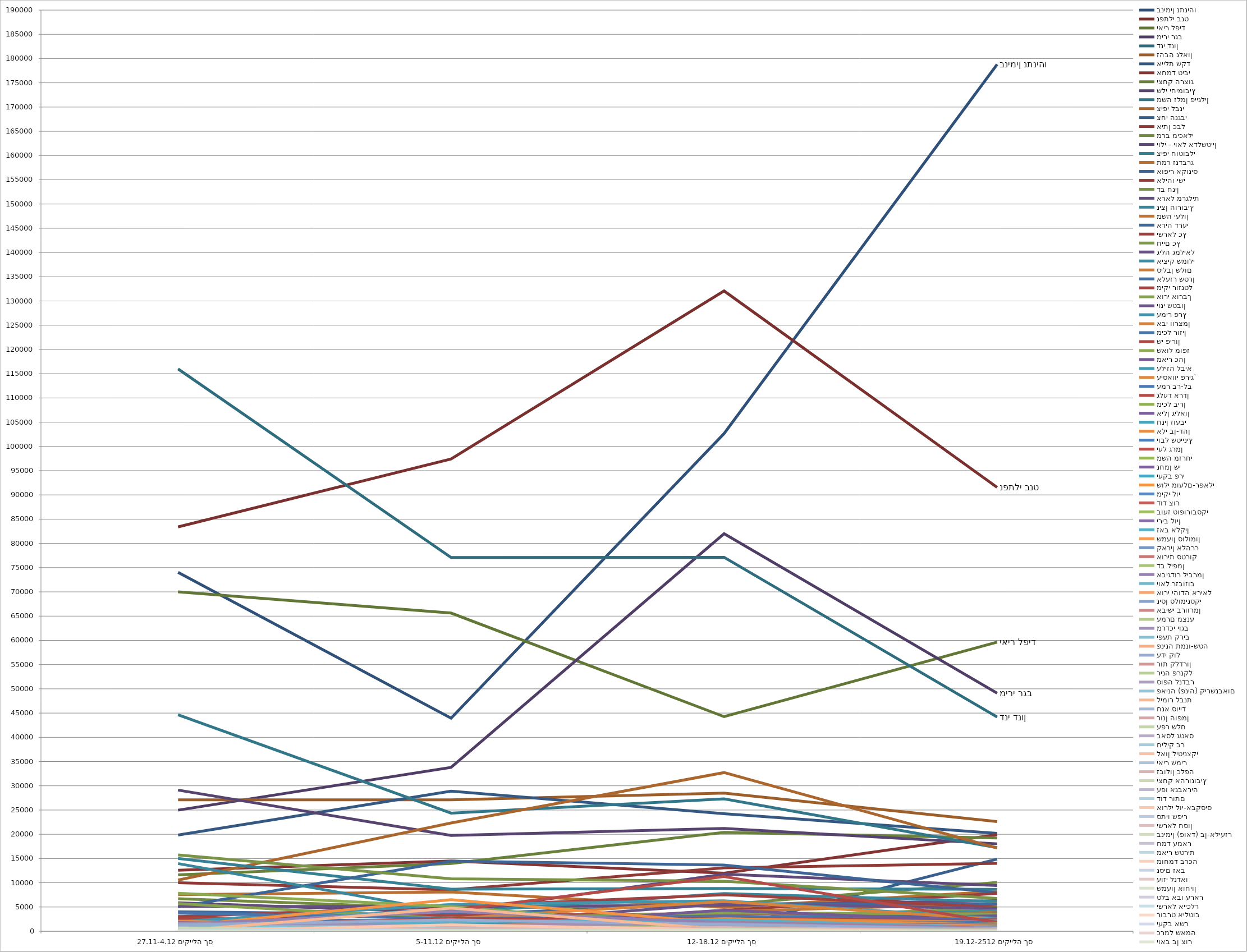
| Category | בנימין נתניהו | נפתלי בנט | יאיר לפיד | מירי רגב | דני דנון | זהבה גלאון | איילת שקד | אחמד טיבי | יצחק הרצוג | שלי יחימוביץ | משה זלמן פייגלין | ציפי לבני | צחי הנגבי | איתן כבל | מרב מיכאלי | יולי - יואל אדלשטיין | ציפי חוטובלי | תמר זנדברג | אופיר אקוניס | אליהו ישי | דב חנין | אראל מרגלית | ניצן הורוביץ | משה יעלון | אריה דרעי | ישראל כץ | חיים כץ | גילה גמליאל | איציק שמולי | סילבן שלום | אלעזר שטרן | מיקי רוזנטל | אורי אורבך | יוני שטבון | עמיר פרץ | אבי וורצמן | מיכל רוזין | שי פירון | שאול מופז | מאיר כהן | עליזה לביא | עיסאווי פריג` | עמר בר-לב | גלעד ארדן | מיכל בירן | אילן גילאון | חנין זועבי | אלי בן-דהן | יובל שטייניץ | יעל גרמן | משה מזרחי | נחמן שי | יעקב פרי | שולי מועלם-רפאלי | מיקי לוי | דוד צור | בועז טופורובסקי | יריב לוין | זאב אלקין | שמעון סולומון | קארין אלהרר | אורית סטרוק | דב ליפמן | אביגדור ליברמן | יואל רזבוזוב | אורי יהודה אריאל | ניסן סלומינסקי | אבישי ברוורמן | עמרם מצנע | מרדכי יוגב | יפעת קריב | פנינה תמנו-שטה | עדי קול | רות קלדרון | רינה פרנקל | סופה לנדבר | פאינה (פניה) קירשנבאום | לימור לבנת | חנא סוייד | רונן הופמן | עפר שלח | באסל גטאס | חיליק בר | לאון ליטינצקי | יאיר שמיר | זבולון כלפה | יצחק אהרונוביץ | עפו אגבאריה | דוד רותם | אורלי לוי-אבקסיס | סתיו שפיר | ישראל חסון | בנימין (פואד) בן-אליעזר | חמד עמאר | מאיר שטרית | מוחמד ברכה | נסים זאב | עוזי לנדאו | שמעון אוחיון | טלב אבו עראר | ישראל אייכלר | רוברט אילטוב | יעקב אשר | כרמל שאמה | יואב בן צור |
|---|---|---|---|---|---|---|---|---|---|---|---|---|---|---|---|---|---|---|---|---|---|---|---|---|---|---|---|---|---|---|---|---|---|---|---|---|---|---|---|---|---|---|---|---|---|---|---|---|---|---|---|---|---|---|---|---|---|---|---|---|---|---|---|---|---|---|---|---|---|---|---|---|---|---|---|---|---|---|---|---|---|---|---|---|---|---|---|---|---|---|---|---|---|---|---|---|---|---|---|---|---|---|---|---|---|
| סך הלייקים 27.11-4.12 | 74031 | 83399 | 70018 | 24976 | 115992 | 27110 | 19846 | 12591 | 11641 | 29113 | 44650 | 10556 | 558 | 9996 | 6722 | 5868 | 15012 | 7538 | 5038 | 3035 | 15748 | 5117 | 13959 | 1572 | 4017 | 3009 | 1205 | 202 | 1319 | 837 | 2555 | 2588 | 5692 | 911 | 1999 | 968 | 3720 | 1043 | 7829 | 1446 | 1173 | 407 | 1268 | 892 | 207 | 1391 | 910 | 2081 | 711 | 396 | 815 | 98 | 310 | 1093 | 1155 | 203 | 221 | 1793 | 117 | 54 | 1116 | 858 | 598 | 1443 | 824 | 364 | 71 | 123 | 365 | 1608 | 988 | 277 | 1308 | 307 | 177 | 321 | 5 | 68 | 66 | 164 | 143 | 66 | 137 | 21 | 67 | 356 | 660 | 48 | 0 | 0 | 0 | 0 | 0 | 0 | 308 | 0 | 0 | 8 | 60 | 0 | 0 | 73 | 0 | 0 | 0 |
| סך הלייקים 5-11.12 | 43950 | 97411 | 65628 | 33802 | 77100 | 27110 | 28910 | 14492 | 13976 | 19766 | 24371 | 22328 | 0 | 8524 | 4695 | 3842 | 8675 | 8089 | 14450 | 617 | 10807 | 5132 | 3880 | 1070 | 3409 | 5125 | 971 | 1413 | 1664 | 800 | 2047 | 3272 | 2585 | 1439 | 5516 | 2610 | 2599 | 2609 | 5101 | 698 | 1527 | 914 | 1008 | 4287 | 734 | 1192 | 4689 | 834 | 691 | 1052 | 912 | 77 | 1365 | 6514 | 1106 | 18 | 519 | 768 | 2007 | 51 | 1095 | 1041 | 309 | 4092 | 516 | 486 | 487 | 37 | 328 | 1127 | 885 | 319 | 2352 | 413 | 148 | 136 | 232 | 4772 | 0 | 231 | 424 | 31 | 113 | 87 | 67 | 568 | 180 | 67 | 0 | 1329 | 0 | 0 | 0 | 0 | 122 | 0 | 0 | 0 | 22 | 0 | 0 | 0 | 0 | 0 | 0 |
| סך הלייקים 12-18.12 | 102660 | 132073 | 44264 | 82007 | 77133 | 28498 | 24238 | 11989 | 20387 | 21200 | 27315 | 32727 | 559 | 13067 | 5506 | 11761 | 8816 | 4923 | 13641 | 4301 | 10329 | 5339 | 7774 | 4081 | 5687 | 7516 | 2603 | 5666 | 2574 | 1910 | 2014 | 3638 | 3769 | 2308 | 6282 | 6123 | 3125 | 2666 | 511 | 4347 | 1545 | 2546 | 1521 | 11278 | 558 | 1476 | 913 | 2606 | 1242 | 1178 | 1092 | 753 | 0 | 1679 | 828 | 197 | 171 | 1829 | 2342 | 142 | 1145 | 1847 | 1491 | 1832 | 213 | 0 | 82 | 830 | 593 | 1550 | 579 | 98 | 1424 | 186 | 275 | 300 | 26 | 378 | 132 | 256 | 0 | 132 | 110 | 87 | 37 | 740 | 444 | 138 | 0 | 286 | 0 | 0 | 0 | 0 | 60 | 0 | 0 | 0 | 184 | 0 | 0 | 28 | 0 | 0 | 0 |
| סך הלייקים 19.12-2512 | 178796 | 91568 | 59642 | 49097 | 44183 | 22628 | 20193 | 19923 | 19238 | 18037 | 17232 | 17172 | 14876 | 13999 | 10082 | 9439 | 8659 | 8222 | 7966 | 7800 | 6772 | 6311 | 6144 | 5676 | 5557 | 4967 | 4813 | 4680 | 4222 | 3922 | 3831 | 3695 | 3588 | 3189 | 2642 | 2457 | 2432 | 2237 | 2152 | 1975 | 1916 | 1869 | 1836 | 1755 | 1542 | 1322 | 1310 | 1299 | 1289 | 1272 | 1247 | 1186 | 1121 | 1052 | 894 | 890 | 804 | 769 | 755 | 753 | 721 | 720 | 648 | 596 | 572 | 535 | 534 | 524 | 467 | 460 | 450 | 449 | 397 | 384 | 347 | 318 | 280 | 271 | 212 | 208 | 199 | 185 | 155 | 153 | 139 | 121 | 96 | 70 | 11 | 0 | 0 | 0 | 0 | 0 | 0 | 0 | 0 | 0 | 0 | 0 | 0 | 0 | 0 | 0 | 0 |